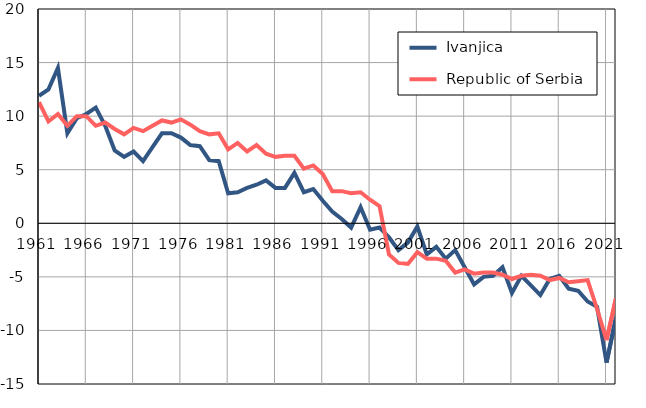
| Category |  Ivanjica |  Republic of Serbia |
|---|---|---|
| 1961.0 | 11.9 | 11.3 |
| 1962.0 | 12.5 | 9.5 |
| 1963.0 | 14.5 | 10.2 |
| 1964.0 | 8.4 | 9.1 |
| 1965.0 | 9.8 | 10 |
| 1966.0 | 10.2 | 10 |
| 1967.0 | 10.8 | 9.1 |
| 1968.0 | 9.1 | 9.4 |
| 1969.0 | 6.8 | 8.8 |
| 1970.0 | 6.2 | 8.3 |
| 1971.0 | 6.7 | 8.9 |
| 1972.0 | 5.8 | 8.6 |
| 1973.0 | 7.1 | 9.1 |
| 1974.0 | 8.4 | 9.6 |
| 1975.0 | 8.4 | 9.4 |
| 1976.0 | 8 | 9.7 |
| 1977.0 | 7.3 | 9.2 |
| 1978.0 | 7.2 | 8.6 |
| 1979.0 | 5.9 | 8.3 |
| 1980.0 | 5.8 | 8.4 |
| 1981.0 | 2.8 | 6.9 |
| 1982.0 | 2.9 | 7.5 |
| 1983.0 | 3.3 | 6.7 |
| 1984.0 | 3.6 | 7.3 |
| 1985.0 | 4 | 6.5 |
| 1986.0 | 3.3 | 6.2 |
| 1987.0 | 3.3 | 6.3 |
| 1988.0 | 4.7 | 6.3 |
| 1989.0 | 2.9 | 5.1 |
| 1990.0 | 3.2 | 5.4 |
| 1991.0 | 2.1 | 4.6 |
| 1992.0 | 1.1 | 3 |
| 1993.0 | 0.4 | 3 |
| 1994.0 | -0.4 | 2.8 |
| 1995.0 | 1.5 | 2.9 |
| 1996.0 | -0.6 | 2.2 |
| 1997.0 | -0.4 | 1.6 |
| 1998.0 | -1.3 | -2.9 |
| 1999.0 | -2.5 | -3.7 |
| 2000.0 | -1.8 | -3.8 |
| 2001.0 | -0.3 | -2.7 |
| 2002.0 | -2.9 | -3.3 |
| 2003.0 | -2.2 | -3.3 |
| 2004.0 | -3.3 | -3.5 |
| 2005.0 | -2.5 | -4.6 |
| 2006.0 | -4.1 | -4.3 |
| 2007.0 | -5.7 | -4.7 |
| 2008.0 | -5 | -4.6 |
| 2009.0 | -4.9 | -4.6 |
| 2010.0 | -4.1 | -4.8 |
| 2011.0 | -6.5 | -5.2 |
| 2012.0 | -4.9 | -4.9 |
| 2013.0 | -5.8 | -4.8 |
| 2014.0 | -6.7 | -4.9 |
| 2015.0 | -5.2 | -5.3 |
| 2016.0 | -4.9 | -5.1 |
| 2017.0 | -6.1 | -5.5 |
| 2018.0 | -6.3 | -5.4 |
| 2019.0 | -7.3 | -5.3 |
| 2020.0 | -7.8 | -8 |
| 2021.0 | -13 | -10.9 |
| 2022.0 | -8.8 | -7 |